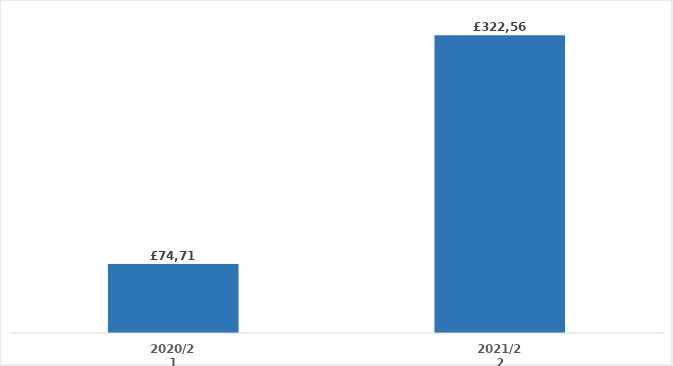
| Category | Series 0 |
|---|---|
| 2020/21 | 74715.696 |
| 2021/22 | 322569.492 |